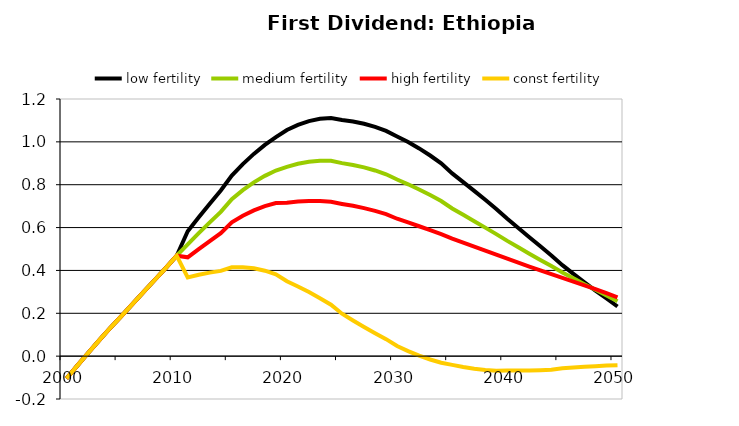
| Category | low fertility | medium fertility | high fertility | const fertility |
|---|---|---|---|---|
| 2000.0 | -0.104 | -0.104 | -0.104 | -0.104 |
| 2001.0 | -0.043 | -0.043 | -0.043 | -0.043 |
| 2002.0 | 0.017 | 0.017 | 0.017 | 0.017 |
| 2003.0 | 0.076 | 0.076 | 0.076 | 0.076 |
| 2004.0 | 0.134 | 0.134 | 0.134 | 0.134 |
| 2005.0 | 0.188 | 0.188 | 0.188 | 0.188 |
| 2006.0 | 0.244 | 0.244 | 0.244 | 0.244 |
| 2007.0 | 0.3 | 0.3 | 0.3 | 0.3 |
| 2008.0 | 0.355 | 0.355 | 0.355 | 0.355 |
| 2009.0 | 0.41 | 0.41 | 0.41 | 0.41 |
| 2010.0 | 0.469 | 0.469 | 0.469 | 0.469 |
| 2011.0 | 0.583 | 0.522 | 0.461 | 0.368 |
| 2012.0 | 0.648 | 0.574 | 0.5 | 0.38 |
| 2013.0 | 0.712 | 0.624 | 0.537 | 0.39 |
| 2014.0 | 0.773 | 0.673 | 0.574 | 0.398 |
| 2015.0 | 0.843 | 0.733 | 0.624 | 0.415 |
| 2016.0 | 0.896 | 0.775 | 0.655 | 0.415 |
| 2017.0 | 0.944 | 0.811 | 0.68 | 0.41 |
| 2018.0 | 0.986 | 0.841 | 0.7 | 0.399 |
| 2019.0 | 1.022 | 0.866 | 0.714 | 0.382 |
| 2020.0 | 1.055 | 0.883 | 0.716 | 0.35 |
| 2021.0 | 1.079 | 0.898 | 0.722 | 0.325 |
| 2022.0 | 1.097 | 0.907 | 0.724 | 0.299 |
| 2023.0 | 1.107 | 0.912 | 0.724 | 0.271 |
| 2024.0 | 1.112 | 0.911 | 0.72 | 0.24 |
| 2025.0 | 1.102 | 0.901 | 0.71 | 0.198 |
| 2026.0 | 1.095 | 0.892 | 0.702 | 0.167 |
| 2027.0 | 1.085 | 0.881 | 0.691 | 0.136 |
| 2028.0 | 1.07 | 0.866 | 0.678 | 0.107 |
| 2029.0 | 1.051 | 0.849 | 0.663 | 0.079 |
| 2030.0 | 1.025 | 0.824 | 0.641 | 0.047 |
| 2031.0 | 0.999 | 0.802 | 0.624 | 0.023 |
| 2032.0 | 0.969 | 0.778 | 0.606 | 0.002 |
| 2033.0 | 0.936 | 0.752 | 0.588 | -0.016 |
| 2034.0 | 0.9 | 0.724 | 0.569 | -0.031 |
| 2035.0 | 0.853 | 0.689 | 0.549 | -0.041 |
| 2036.0 | 0.812 | 0.66 | 0.53 | -0.051 |
| 2037.0 | 0.771 | 0.63 | 0.511 | -0.059 |
| 2038.0 | 0.73 | 0.6 | 0.492 | -0.065 |
| 2039.0 | 0.687 | 0.57 | 0.473 | -0.068 |
| 2040.0 | 0.641 | 0.538 | 0.455 | -0.067 |
| 2041.0 | 0.598 | 0.508 | 0.436 | -0.068 |
| 2042.0 | 0.555 | 0.478 | 0.418 | -0.067 |
| 2043.0 | 0.512 | 0.449 | 0.4 | -0.066 |
| 2044.0 | 0.47 | 0.42 | 0.382 | -0.063 |
| 2045.0 | 0.425 | 0.391 | 0.366 | -0.056 |
| 2046.0 | 0.384 | 0.363 | 0.348 | -0.053 |
| 2047.0 | 0.344 | 0.336 | 0.33 | -0.05 |
| 2048.0 | 0.306 | 0.309 | 0.312 | -0.047 |
| 2049.0 | 0.269 | 0.284 | 0.294 | -0.044 |
| 2050.0 | 0.232 | 0.257 | 0.274 | -0.042 |